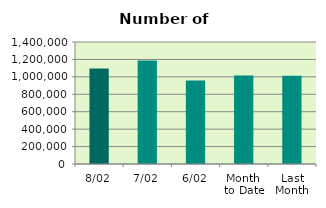
| Category | Series 0 |
|---|---|
| 8/02 | 1096852 |
| 7/02 | 1188858 |
| 6/02 | 958550 |
| Month 
to Date | 1016558.333 |
| Last
Month | 1012702.182 |